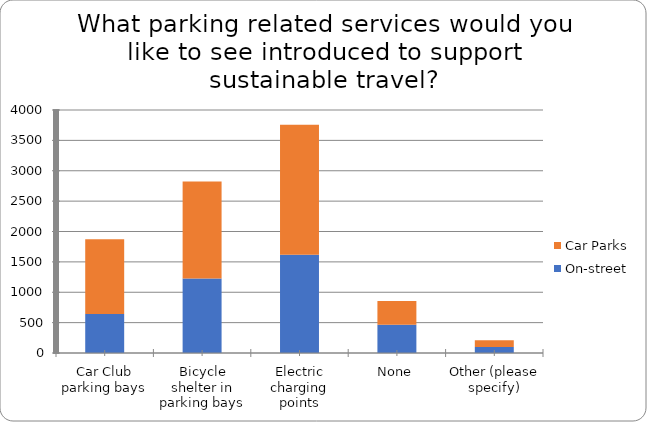
| Category | On-street | Car Parks |
|---|---|---|
| Car Club parking bays | 643 | 1228 |
| Bicycle shelter in parking bays | 1227 | 1595 |
| Electric charging points | 1619 | 2139 |
| None | 465 | 390 |
| Other (please specify) | 100 | 111 |